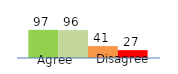
| Category | Series 0 | Series 1 | Series 2 | Series 3 |
|---|---|---|---|---|
| 0 | 97 | 96 | 41 | 27 |